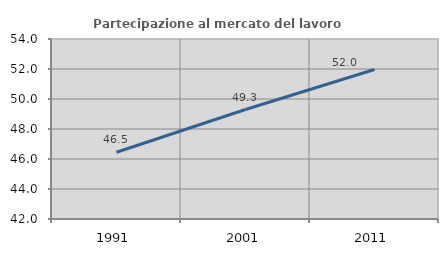
| Category | Partecipazione al mercato del lavoro  femminile |
|---|---|
| 1991.0 | 46.451 |
| 2001.0 | 49.299 |
| 2011.0 | 51.966 |